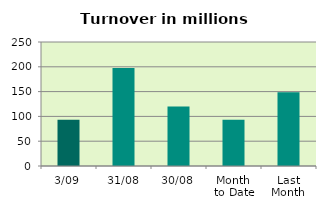
| Category | Series 0 |
|---|---|
| 3/09 | 93.055 |
| 31/08 | 197.625 |
| 30/08 | 120.028 |
| Month 
to Date | 93.055 |
| Last
Month | 148.736 |